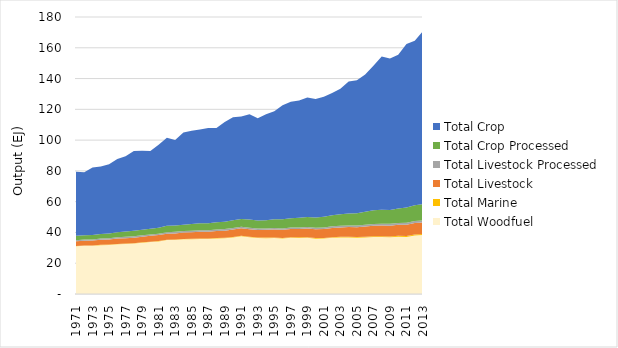
| Category | Total Woodfuel | Total Marine | Total Livestock | Total Livestock Processed  | Total Crop Processed | Total Crop |
|---|---|---|---|---|---|---|
| 1971.0 | 30.996 | 0.189 | 3.057 | 0.74 | 2.794 | 41.628 |
| 1972.0 | 31.29 | 0.198 | 3.133 | 0.773 | 2.766 | 40.906 |
| 1973.0 | 31.314 | 0.208 | 3.165 | 0.787 | 2.914 | 43.773 |
| 1974.0 | 31.729 | 0.214 | 3.296 | 0.803 | 3 | 43.824 |
| 1975.0 | 31.871 | 0.217 | 3.362 | 0.815 | 3.105 | 45.013 |
| 1976.0 | 32.343 | 0.219 | 3.455 | 0.832 | 3.232 | 47.704 |
| 1977.0 | 32.516 | 0.222 | 3.551 | 0.864 | 3.405 | 49.004 |
| 1978.0 | 32.736 | 0.225 | 3.65 | 0.887 | 3.552 | 51.878 |
| 1979.0 | 33.324 | 0.228 | 3.728 | 0.903 | 3.618 | 51.209 |
| 1980.0 | 33.748 | 0.237 | 3.806 | 0.913 | 3.648 | 50.567 |
| 1981.0 | 34.193 | 0.25 | 3.863 | 0.915 | 3.854 | 53.864 |
| 1982.0 | 35.01 | 0.253 | 3.92 | 0.938 | 4.163 | 57.247 |
| 1983.0 | 35.078 | 0.26 | 4.053 | 0.986 | 4.118 | 55.512 |
| 1984.0 | 35.499 | 0.272 | 4.15 | 0.987 | 4.167 | 59.801 |
| 1985.0 | 35.598 | 0.285 | 4.256 | 1.003 | 4.276 | 60.642 |
| 1986.0 | 35.796 | 0.299 | 4.373 | 1.021 | 4.435 | 60.982 |
| 1987.0 | 35.716 | 0.312 | 4.456 | 1.009 | 4.56 | 61.745 |
| 1988.0 | 36.071 | 0.319 | 4.575 | 1.02 | 4.699 | 61.251 |
| 1989.0 | 36.163 | 0.331 | 4.64 | 1.036 | 4.803 | 64.841 |
| 1990.0 | 36.764 | 0.335 | 4.762 | 1.053 | 5.028 | 66.967 |
| 1991.0 | 37.512 | 0.328 | 4.82 | 1.001 | 5.12 | 66.613 |
| 1992.0 | 36.921 | 0.329 | 4.842 | 0.954 | 5.286 | 68.509 |
| 1993.0 | 36.316 | 0.344 | 4.914 | 0.953 | 5.187 | 66.537 |
| 1994.0 | 36.302 | 0.366 | 5.037 | 0.939 | 5.274 | 68.846 |
| 1995.0 | 36.371 | 0.395 | 5.182 | 0.941 | 5.725 | 70.19 |
| 1996.0 | 36.039 | 0.412 | 5.238 | 0.934 | 6.005 | 73.945 |
| 1997.0 | 36.472 | 0.418 | 5.355 | 0.946 | 6.114 | 75.586 |
| 1998.0 | 36.397 | 0.425 | 5.494 | 0.964 | 6.281 | 76.182 |
| 1999.0 | 36.523 | 0.435 | 5.631 | 0.986 | 6.541 | 77.611 |
| 2000.0 | 35.913 | 0.446 | 5.736 | 1.002 | 6.679 | 77.003 |
| 2001.0 | 36 | 0.457 | 5.803 | 1.024 | 6.87 | 78.077 |
| 2002.0 | 36.493 | 0.463 | 5.961 | 1.059 | 7.212 | 79.493 |
| 2003.0 | 36.73 | 0.471 | 6.086 | 1.066 | 7.546 | 81.4 |
| 2004.0 | 36.792 | 0.488 | 6.212 | 1.081 | 7.667 | 85.845 |
| 2005.0 | 36.55 | 0.503 | 6.377 | 1.103 | 7.937 | 86.406 |
| 2006.0 | 36.756 | 0.52 | 6.538 | 1.115 | 8.544 | 89.099 |
| 2007.0 | 37.009 | 0.543 | 6.723 | 1.144 | 8.988 | 93.876 |
| 2008.0 | 37.047 | 0.559 | 6.892 | 1.163 | 9.013 | 99.668 |
| 2009.0 | 36.853 | 0.574 | 6.995 | 1.168 | 8.93 | 98.587 |
| 2010.0 | 37.188 | 0.59 | 7.163 | 1.195 | 9.427 | 99.911 |
| 2011.0 | 37.119 | 0.601 | 7.281 | 1.218 | 9.995 | 106.197 |
| 2012.0 | 38.049 | 0.615 | 7.44 | 1.256 | 10.386 | 106.742 |
| 2013.0 | 38.33 | 0.614 | 7.582 | 1.28 | 10.525 | 112.495 |